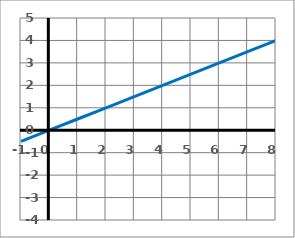
| Category | y |
|---|---|
| -1.0 | -0.5 |
| 0.0 | 0 |
| 1.0 | 0.5 |
| 2.0 | 1 |
| 3.0 | 1.5 |
| 4.0 | 2 |
| 5.0 | 2.5 |
| 6.0 | 3 |
| 7.0 | 3.5 |
| 8.0 | 4 |